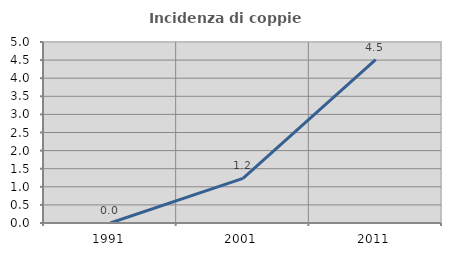
| Category | Incidenza di coppie miste |
|---|---|
| 1991.0 | 0 |
| 2001.0 | 1.235 |
| 2011.0 | 4.516 |